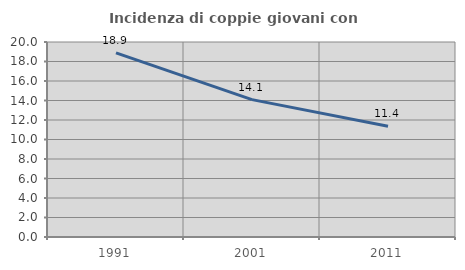
| Category | Incidenza di coppie giovani con figli |
|---|---|
| 1991.0 | 18.886 |
| 2001.0 | 14.087 |
| 2011.0 | 11.355 |